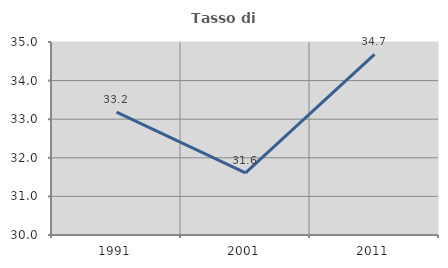
| Category | Tasso di occupazione   |
|---|---|
| 1991.0 | 33.184 |
| 2001.0 | 31.608 |
| 2011.0 | 34.68 |